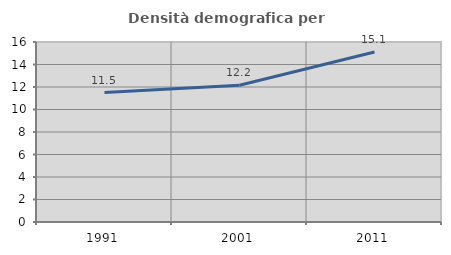
| Category | Densità demografica |
|---|---|
| 1991.0 | 11.508 |
| 2001.0 | 12.161 |
| 2011.0 | 15.109 |